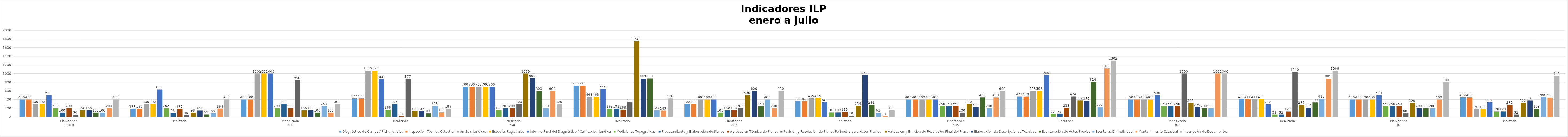
| Category | Diagnóstico de Campo / Ficha Jurídica | Inspección Técnica Catastral | Análisis Jurídicos | Estudios Registrales | Informe Final del Diagnóstico / Calificación Jurídica | Mediciones Topográficas | Procesamiento y Elaboración de Planos | Aprobación Técnica de Planos | Revision y Resolucion de Planos Perimetro para Actos Previos | Validacion y Emision de Resolucion Final del Plano | Elaboración de Descripciones Técnicas | Escrituración de Actos Previos | Escrituración Individual | Mantenimiento Catastral | Inscripción de Documentos |
|---|---|---|---|---|---|---|---|---|---|---|---|---|---|---|---|
| 0 | 400 | 400 | 300 | 300 | 500 | 200 | 100 | 200 | 50 | 150 | 150 | 100 | 100 | 200 | 400 |
| 1 | 188 | 190 | 300 | 300 | 635 | 202 | 93 | 187 | 45 | 98 | 146 | 53 | 88 | 194 | 408 |
| 2 | 400 | 400 | 1000 | 1000 | 1000 | 200 | 300 | 200 | 850 | 150 | 150 | 100 | 250 | 100 | 300 |
| 3 | 427 | 427 | 1070 | 1070 | 868 | 166 | 295 | 13 | 877 | 139 | 136 | 80 | 253 | 105 | 189 |
| 4 | 700 | 700 | 700 | 700 | 700 | 150 | 200 | 200 | 300 | 1000 | 900 | 600 | 200 | 600 | 300 |
| 5 | 723 | 723 | 463 | 463 | 644 | 192 | 192 | 168 | 339 | 1746 | 883 | 888 | 149 | 145 | 426 |
| 6 | 300 | 300 | 400 | 400 | 400 | 100 | 150 | 150 | 200 | 500 | 600 | 250 | 400 | 200 | 600 |
| 7 | 360 | 360 | 435 | 435 | 342 | 103 | 103 | 115 | 28 | 254 | 967 | 281 | 93 | 21 | 150 |
| 8 | 400 | 400 | 400 | 400 | 400 | 250 | 250 | 250 | 100 | 300 | 225 | 450 | 200 | 450 | 600 |
| 9 | 473 | 473 | 598 | 598 | 965 | 75 | 75 | 213 | 474 | 382 | 370 | 814 | 222 | 1123 | 1302 |
| 10 | 400 | 400 | 400 | 400 | 500 | 250 | 250 | 250 | 1000 | 320 | 225 | 200 | 200 | 1000 | 1000 |
| 11 | 411 | 411 | 411 | 411 | 292 | 52 | 52 | 127 | 1040 | 277 | 217 | 333 | 419 | 885 | 1066 |
| 12 | 400 | 400 | 400 | 400 | 500 | 250 | 250 | 250 | 80 | 320 | 200 | 200 | 200 | 400 | 800 |
| 13 | 452 | 452 | 181 | 181 | 337 | 128 | 128 | 279 | 52 | 322 | 381 | 189 | 460 | 444 | 945 |